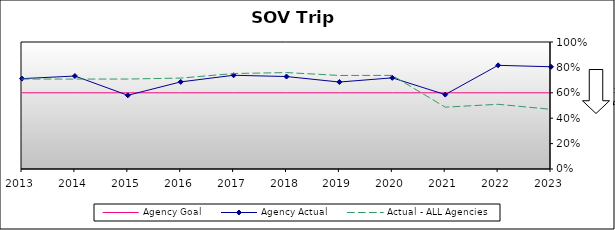
| Category | Agency Goal | Agency Actual | Actual - ALL Agencies |
|---|---|---|---|
| 2013.0 | 0.6 | 0.712 | 0.708 |
| 2014.0 | 0.6 | 0.732 | 0.708 |
| 2015.0 | 0.6 | 0.58 | 0.708 |
| 2016.0 | 0.6 | 0.686 | 0.716 |
| 2017.0 | 0.6 | 0.738 | 0.752 |
| 2018.0 | 0.6 | 0.728 | 0.759 |
| 2019.0 | 0.6 | 0.685 | 0.736 |
| 2020.0 | 0.6 | 0.718 | 0.737 |
| 2021.0 | 0.6 | 0.586 | 0.487 |
| 2022.0 | 0.6 | 0.816 | 0.509 |
| 2023.0 | 0.6 | 0.805 | 0.47 |